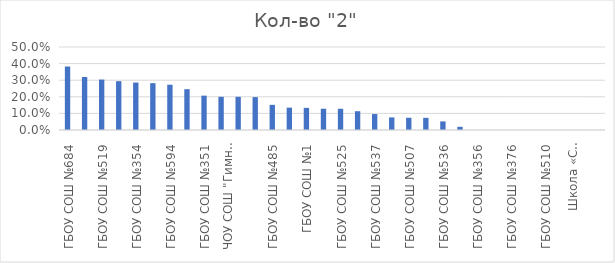
| Category | Series 0 |
|---|---|
| ГБОУ СОШ №684 | 0.382 |
| ГБОУ СОШ №495 | 0.319 |
| ГБОУ СОШ №519 | 0.304 |
| ГБОУ СОШ №484 | 0.294 |
| ГБОУ СОШ №354 | 0.286 |
| ГБОУ ЦО №2 | 0.282 |
| ГБОУ СОШ №594 | 0.273 |
| ГБОУ СОШ №643 | 0.246 |
| ГБОУ СОШ №351 | 0.207 |
| ГБОУ СОШ №489 | 0.2 |
| ЧОУ СОШ "Гимназия"Северная Венеция | 0.2 |
| ГБОУ СОШ №544 | 0.198 |
| ГБОУ СОШ №485 | 0.152 |
| ГБОУ СОШ №355 | 0.135 |
| ГБОУ СОШ №1 | 0.133 |
| Район | 0.128 |
| ГБОУ СОШ №525 | 0.128 |
| ГБОУ СОШ №508 | 0.113 |
| ГБОУ СОШ №537 | 0.096 |
| ГБОУ гимназия №526 | 0.076 |
| ГБОУ СОШ №507 | 0.074 |
| ГБОУ СОШ №362 | 0.073 |
| ГБОУ СОШ №536 | 0.052 |
| ГБОУ гимназия №524 | 0.019 |
| ГБОУ СОШ №356 | 0 |
| ГБОУ СОШ №371 | 0 |
| ГБОУ СОШ №376 | 0 |
| ГБОУ СОШ №496 | 0 |
| ГБОУ СОШ №510 | 0 |
| ГБОУ СОШ №543 | 0 |
| Школа «Студиум» | 0 |
| ЧОУ СВШ | 0 |